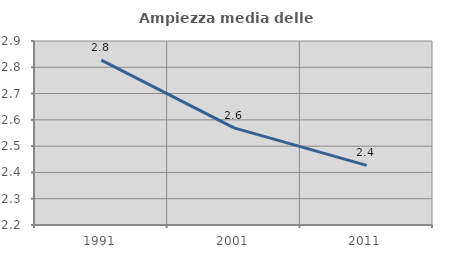
| Category | Ampiezza media delle famiglie |
|---|---|
| 1991.0 | 2.827 |
| 2001.0 | 2.57 |
| 2011.0 | 2.427 |